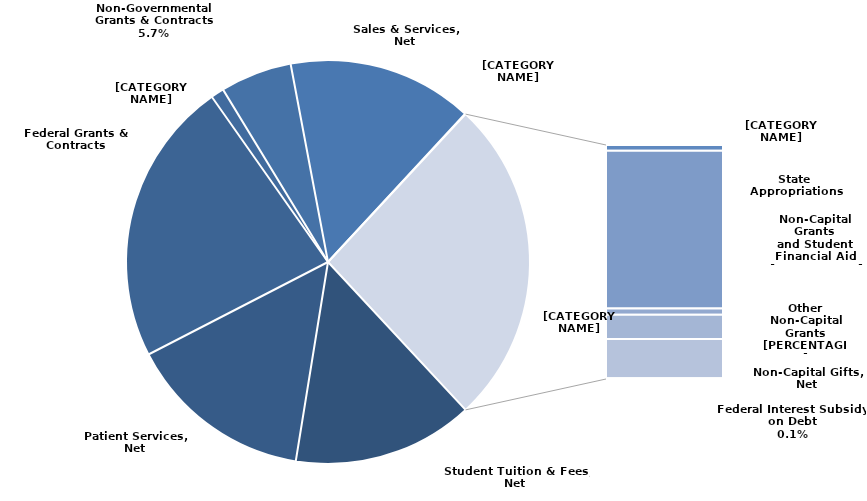
| Category | Revenue |
|---|---|
| Student Tuition & Fees, Net | 405808354 |
| Patient Services, Net | 416811591 |
| Federal Grants & Contracts | 639350719 |
| State & Local Grants & Contracts | 29432614 |
| Non-Governmental Grants & Contracts | 160714422 |
| Sales & Services, Net | 416012618 |
| Interest Earnings on Loans | 1449722 |
| Other Operating Revenues | 17631796 |
| State Appropriations | 493923004 |
| Non-Capital Grants – Student Financial Aid | 19607307 |
| Other Non-Capital Grants | 75955561 |
| Non-Capital Gifts, Net | 123455737 |
| Federal Interest Subsidy on Debt | 2118403 |